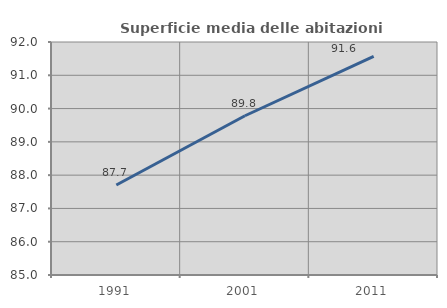
| Category | Superficie media delle abitazioni occupate |
|---|---|
| 1991.0 | 87.704 |
| 2001.0 | 89.784 |
| 2011.0 | 91.571 |